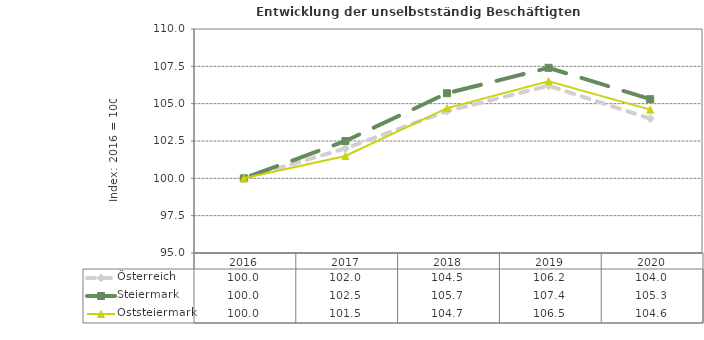
| Category | Österreich | Steiermark | Oststeiermark |
|---|---|---|---|
| 2020.0 | 104 | 105.3 | 104.6 |
| 2019.0 | 106.2 | 107.4 | 106.5 |
| 2018.0 | 104.5 | 105.7 | 104.7 |
| 2017.0 | 102 | 102.5 | 101.5 |
| 2016.0 | 100 | 100 | 100 |